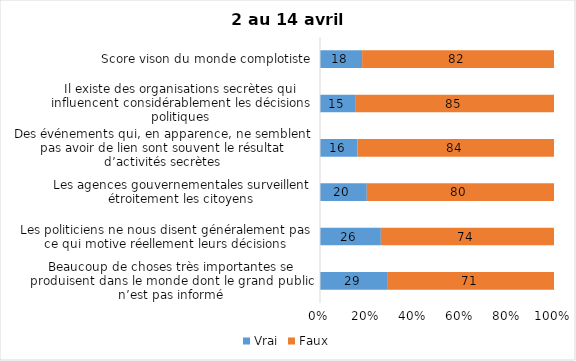
| Category | Vrai | Faux |
|---|---|---|
| Beaucoup de choses très importantes se produisent dans le monde dont le grand public n’est pas informé | 29 | 71 |
| Les politiciens ne nous disent généralement pas ce qui motive réellement leurs décisions | 26 | 74 |
| Les agences gouvernementales surveillent étroitement les citoyens | 20 | 80 |
| Des événements qui, en apparence, ne semblent pas avoir de lien sont souvent le résultat d’activités secrètes | 16 | 84 |
| Il existe des organisations secrètes qui influencent considérablement les décisions politiques | 15 | 85 |
| Score vison du monde complotiste | 18 | 82 |